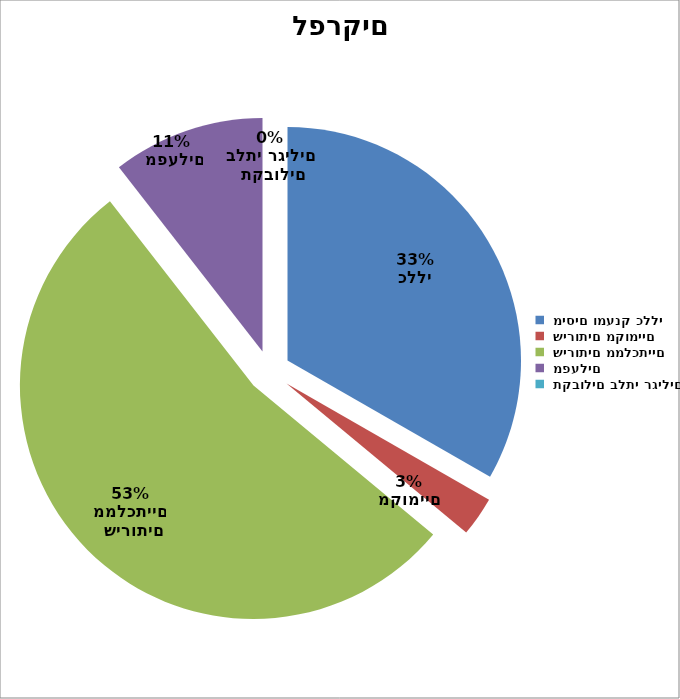
| Category | Series 0 |
|---|---|
|  מיסים ומענק כללי | 24164000 |
|  שירותים מקומיים | 1986000 |
|  שירותים ממלכתיים | 38791000 |
|  מפעלים | 7650000 |
|  תקבולים בלתי רגילים | 0 |